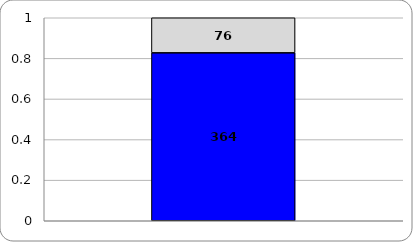
| Category | Series 0 | Series 1 |
|---|---|---|
|  | 364 | 76 |